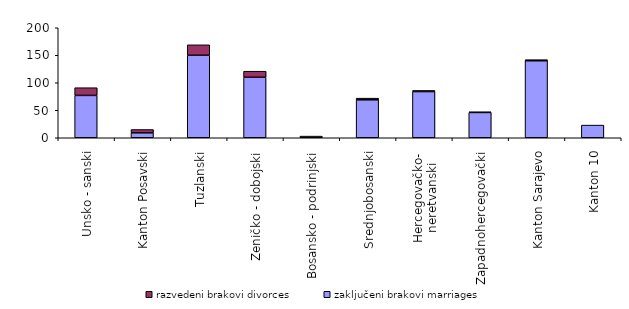
| Category | zaključeni brakovi marriages | razvedeni brakovi divorces |
|---|---|---|
| Unsko - sanski | 77 | 14 |
| Kanton Posavski | 9 | 6 |
| Tuzlanski | 150 | 19 |
| Zeničko - dobojski | 110 | 11 |
| Bosansko - podrinjski | 3 | 0 |
| Srednjobosanski | 69 | 3 |
| Hercegovačko-
neretvanski | 84 | 2 |
| Zapadnohercegovački | 46 | 1 |
| Kanton Sarajevo | 140 | 2 |
| Kanton 10 | 23 | 0 |